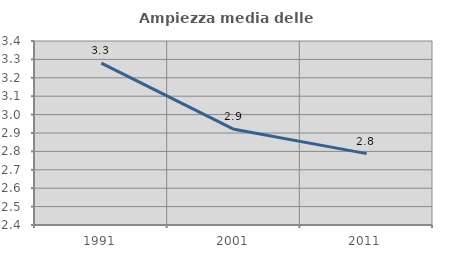
| Category | Ampiezza media delle famiglie |
|---|---|
| 1991.0 | 3.28 |
| 2001.0 | 2.92 |
| 2011.0 | 2.788 |